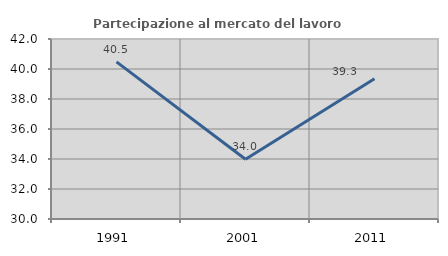
| Category | Partecipazione al mercato del lavoro  femminile |
|---|---|
| 1991.0 | 40.472 |
| 2001.0 | 33.984 |
| 2011.0 | 39.348 |